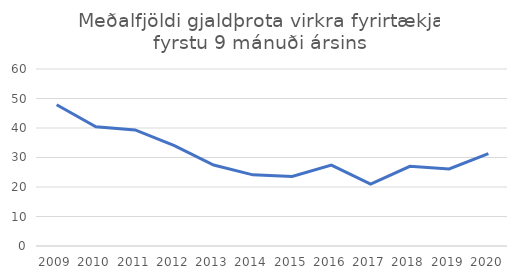
| Category | Series 0 |
|---|---|
| 2009.0 | 47.889 |
| 2010.0 | 40.444 |
| 2011.0 | 39.333 |
| 2012.0 | 34 |
| 2013.0 | 27.444 |
| 2014.0 | 24.111 |
| 2015.0 | 23.556 |
| 2016.0 | 27.444 |
| 2017.0 | 21 |
| 2018.0 | 27 |
| 2019.0 | 26.111 |
| 2020.0 | 31.333 |